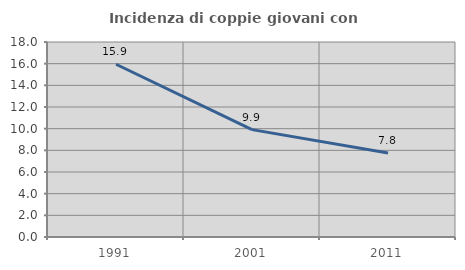
| Category | Incidenza di coppie giovani con figli |
|---|---|
| 1991.0 | 15.945 |
| 2001.0 | 9.912 |
| 2011.0 | 7.755 |